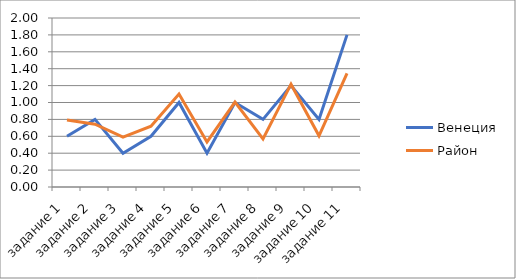
| Category | Венеция | Район |
|---|---|---|
| задание 1 | 0.6 | 0.794 |
| задание 2 | 0.8 | 0.743 |
| задание 3 | 0.4 | 0.59 |
| задание 4 | 0.6 | 0.719 |
| задание 5 | 1 | 1.101 |
| задание 6 | 0.4 | 0.533 |
| задание 7 | 1 | 1.005 |
| задание 8 | 0.8 | 0.569 |
| задание 9 | 1.2 | 1.217 |
| задание 10 | 0.8 | 0.606 |
| задание 11 | 1.8 | 1.346 |